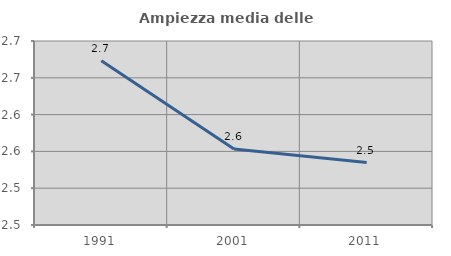
| Category | Ampiezza media delle famiglie |
|---|---|
| 1991.0 | 2.673 |
| 2001.0 | 2.553 |
| 2011.0 | 2.535 |